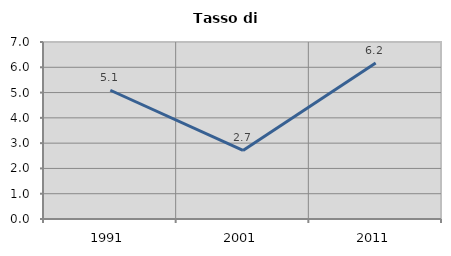
| Category | Tasso di disoccupazione   |
|---|---|
| 1991.0 | 5.092 |
| 2001.0 | 2.71 |
| 2011.0 | 6.171 |